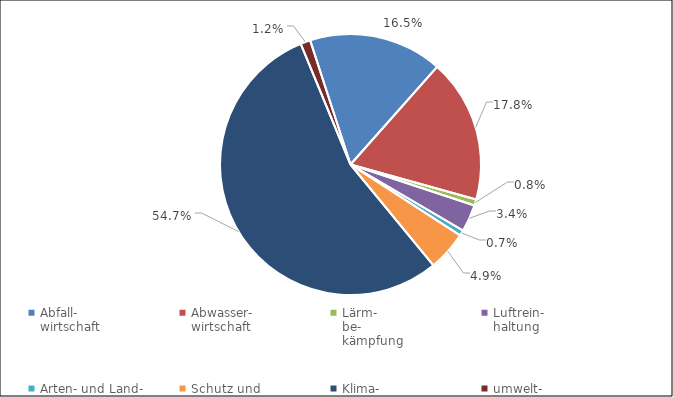
| Category | 2020 |
|---|---|
| Abfall-
wirtschaft | 288584.467 |
| Abwasser-
wirtschaft | 310173.345 |
| Lärm-
be-
kämpfung | 13140.961 |
| Luftrein-
haltung | 58663.894 |
| Arten- und Land-
schafts-
schutz | 12112.664 |
| Schutz und
Sanierung von
Boden, Grund-
u. Ober-
flächen-
wasser | 85658.251 |
| Klima-
schutz | 954639.957 |
| umwelt-
bereichs-
über-
greifend | 21455.723 |